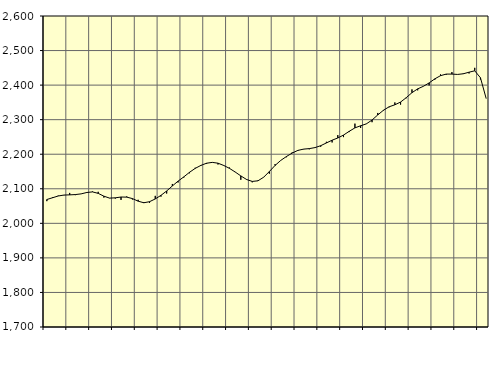
| Category | Piggar | Series 1 |
|---|---|---|
| nan | 2064.2 | 2068.97 |
| 1.0 | 2075.7 | 2074.08 |
| 1.0 | 2080.1 | 2079.1 |
| 1.0 | 2081.3 | 2081.82 |
| nan | 2088 | 2082.37 |
| 2.0 | 2081.6 | 2083.22 |
| 2.0 | 2085.2 | 2085.21 |
| 2.0 | 2087.8 | 2089.26 |
| nan | 2092.3 | 2090.95 |
| 3.0 | 2091.2 | 2086.73 |
| 3.0 | 2074.5 | 2078.58 |
| 3.0 | 2073.4 | 2072.97 |
| nan | 2071.7 | 2073.81 |
| 4.0 | 2067.8 | 2076.16 |
| 4.0 | 2077.8 | 2075.81 |
| 4.0 | 2069 | 2071.62 |
| nan | 2068.1 | 2064.11 |
| 5.0 | 2061.7 | 2059.54 |
| 5.0 | 2059.4 | 2062.64 |
| 5.0 | 2079.5 | 2070.58 |
| nan | 2077.3 | 2080.96 |
| 6.0 | 2086.3 | 2093.64 |
| 6.0 | 2113.9 | 2108.18 |
| 6.0 | 2118.3 | 2122.1 |
| nan | 2132.4 | 2134.39 |
| 7.0 | 2144.9 | 2147.58 |
| 7.0 | 2160.8 | 2158.97 |
| 7.0 | 2166.4 | 2167.66 |
| nan | 2171.9 | 2174.01 |
| 8.0 | 2176.8 | 2176.4 |
| 8.0 | 2170.3 | 2174.03 |
| 8.0 | 2168.4 | 2167.47 |
| nan | 2161.4 | 2159.15 |
| 9.0 | 2148.3 | 2148.66 |
| 9.0 | 2126.1 | 2137.26 |
| 9.0 | 2128 | 2126.98 |
| nan | 2118.7 | 2121.29 |
| 10.0 | 2124.3 | 2123.04 |
| 10.0 | 2133.9 | 2133.37 |
| 10.0 | 2143.7 | 2149.94 |
| nan | 2171.2 | 2167.47 |
| 11.0 | 2181.9 | 2182.09 |
| 11.0 | 2191.3 | 2193.44 |
| 11.0 | 2205.3 | 2203.34 |
| nan | 2210 | 2211.07 |
| 12.0 | 2214.2 | 2214.77 |
| 12.0 | 2214.3 | 2216.24 |
| 12.0 | 2218.9 | 2219.17 |
| nan | 2221.7 | 2224.67 |
| 13.0 | 2236 | 2232.63 |
| 13.0 | 2234.1 | 2240.58 |
| 13.0 | 2255.3 | 2247.01 |
| nan | 2249.5 | 2255.43 |
| 14.0 | 2264.1 | 2266.27 |
| 14.0 | 2288.5 | 2276.29 |
| 14.0 | 2276 | 2282.32 |
| nan | 2288.4 | 2287.79 |
| 15.0 | 2292.7 | 2298.95 |
| 15.0 | 2319.4 | 2313.71 |
| 15.0 | 2326 | 2327.28 |
| nan | 2335.9 | 2337.31 |
| 16.0 | 2349.8 | 2343.04 |
| 16.0 | 2343.6 | 2350.9 |
| 16.0 | 2362 | 2363.73 |
| nan | 2387.6 | 2378.14 |
| 17.0 | 2384.9 | 2389.14 |
| 17.0 | 2396.3 | 2396.58 |
| 17.0 | 2399.1 | 2406.27 |
| nan | 2415.5 | 2418.11 |
| 18.0 | 2430.9 | 2427.31 |
| 18.0 | 2430 | 2431.91 |
| 18.0 | 2437.7 | 2431.91 |
| nan | 2431.1 | 2430.9 |
| 19.0 | 2433.9 | 2432.81 |
| 19.0 | 2433.7 | 2437.39 |
| 19.0 | 2450 | 2441.38 |
| nan | 2416.4 | 2421.26 |
| 20.0 | 2361.1 | 2361.58 |